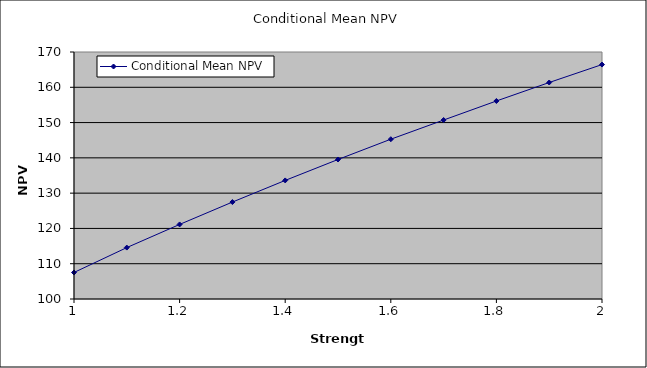
| Category | Conditional Mean NPV |
|---|---|
| 1.0 | 107.518 |
| 1.1 | 114.571 |
| 1.2 | 121.129 |
| 1.3 | 127.469 |
| 1.4 | 133.601 |
| 1.5 | 139.537 |
| 1.6 | 145.286 |
| 1.7 | 150.717 |
| 1.8 | 156.116 |
| 1.9 | 161.354 |
| 2.0 | 166.438 |